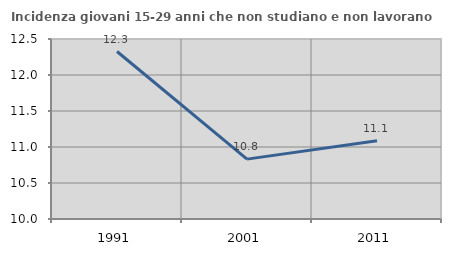
| Category | Incidenza giovani 15-29 anni che non studiano e non lavorano  |
|---|---|
| 1991.0 | 12.326 |
| 2001.0 | 10.832 |
| 2011.0 | 11.085 |